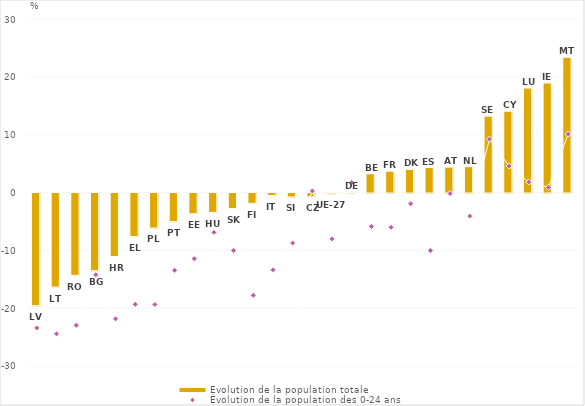
| Category | Évolution de la population totale |
|---|---|
| LV | -19.477 |
| LT | -16.263 |
| RO | -14.241 |
| BG | -13.447 |
| HR | -10.982 |
| EL | -7.536 |
| PL | -6.05 |
| PT | -4.946 |
| EE | -3.568 |
| HU | -3.361 |
| SK | -2.665 |
| FI | -1.794 |
| IT | -0.447 |
| SI | -0.679 |
| CZ | -0.641 |
| UE-27 | -0.126 |
| DE | 0.014 |
| BE | 3.232 |
| FR | 3.687 |
| DK | 3.997 |
| ES | 4.319 |
| AT | 4.396 |
| NL | 4.471 |
| SE | 13.225 |
| CY | 14.06 |
| LU | 18.053 |
| IE | 18.937 |
| MT | 23.388 |